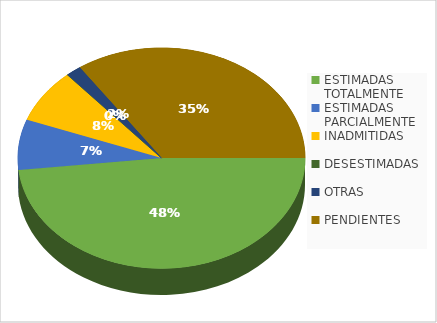
| Category | Series 0 |
|---|---|
| ESTIMADAS TOTALMENTE | 85 |
| ESTIMADAS PARCIALMENTE | 13 |
| INADMITIDAS | 14 |
| DESESTIMADAS | 0 |
| OTRAS | 3 |
| PENDIENTES | 61 |